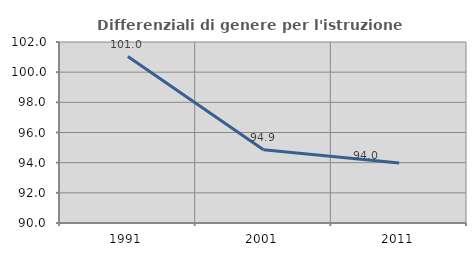
| Category | Differenziali di genere per l'istruzione superiore |
|---|---|
| 1991.0 | 101.035 |
| 2001.0 | 94.863 |
| 2011.0 | 93.981 |